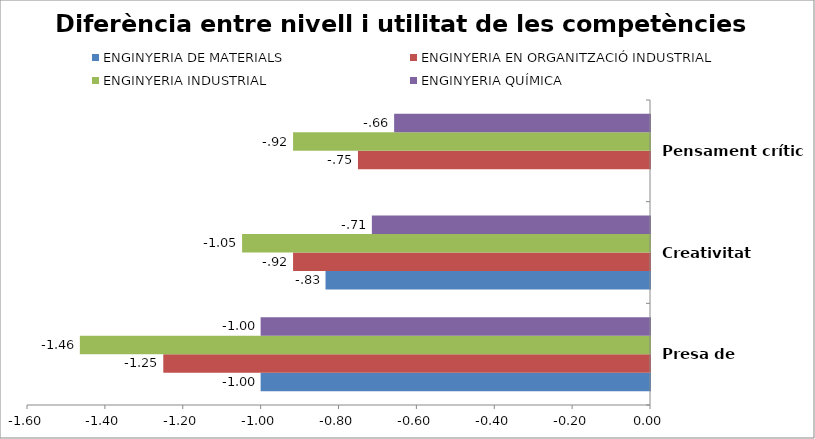
| Category | ENGINYERIA DE MATERIALS | ENGINYERIA EN ORGANITZACIÓ INDUSTRIAL | ENGINYERIA INDUSTRIAL | ENGINYERIA QUÍMICA |
|---|---|---|---|---|
| Presa de decisions | -1 | -1.25 | -1.464 | -1 |
| Creativitat | -0.833 | -0.917 | -1.048 | -0.714 |
| Pensament crític | 0 | -0.75 | -0.917 | -0.657 |